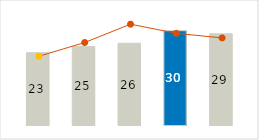
| Category | Other variable cost |
|---|---|
| 0 | 23 |
| 1 | 25 |
| 2 | 26 |
| 3 | 30 |
| 4 | 29 |